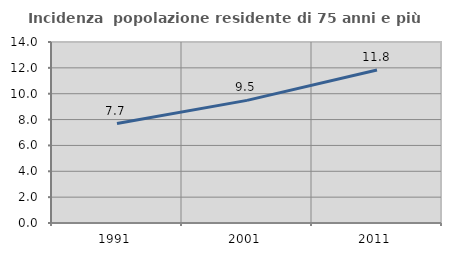
| Category | Incidenza  popolazione residente di 75 anni e più |
|---|---|
| 1991.0 | 7.692 |
| 2001.0 | 9.484 |
| 2011.0 | 11.833 |